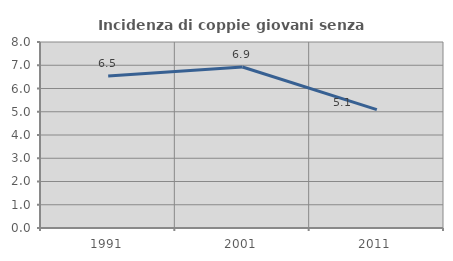
| Category | Incidenza di coppie giovani senza figli |
|---|---|
| 1991.0 | 6.535 |
| 2001.0 | 6.926 |
| 2011.0 | 5.09 |